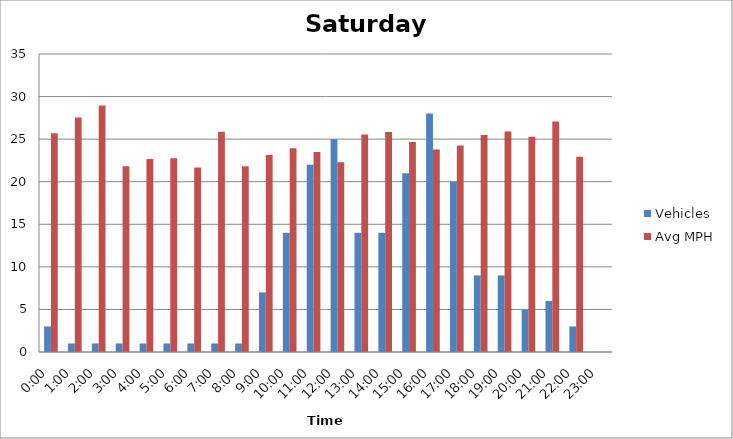
| Category | Vehicles | Avg MPH |
|---|---|---|
| 0:00 | 3 | 25.68 |
| 1:00 | 1 | 27.54 |
| 2:00 | 1 | 28.94 |
| 3:00 | 1 | 21.82 |
| 4:00 | 1 | 22.67 |
| 5:00 | 1 | 22.76 |
| 6:00 | 1 | 21.67 |
| 7:00 | 1 | 25.87 |
| 8:00 | 1 | 21.82 |
| 9:00 | 7 | 23.13 |
| 10:00 | 14 | 23.92 |
| 11:00 | 22 | 23.49 |
| 12:00 | 25 | 22.29 |
| 13:00 | 14 | 25.55 |
| 14:00 | 14 | 25.85 |
| 15:00 | 21 | 24.66 |
| 16:00 | 28 | 23.78 |
| 17:00 | 20 | 24.25 |
| 18:00 | 9 | 25.5 |
| 19:00 | 9 | 25.9 |
| 20:00 | 5 | 25.27 |
| 21:00 | 6 | 27.06 |
| 22:00 | 3 | 22.94 |
| 23:00 | 0 | 0 |